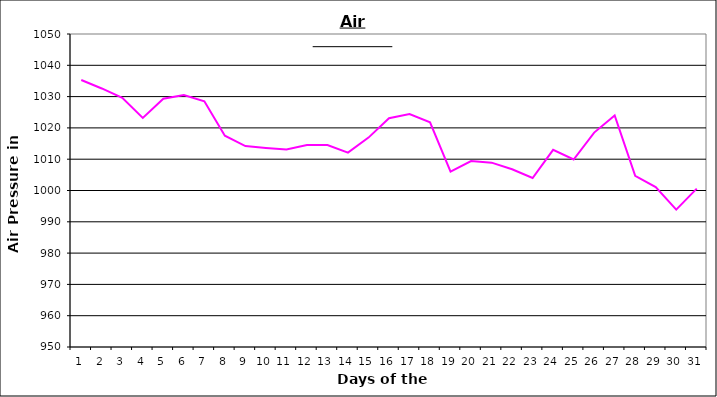
| Category | Series 0 |
|---|---|
| 0 | 1035.3 |
| 1 | 1032.6 |
| 2 | 1029.6 |
| 3 | 1023.2 |
| 4 | 1029.3 |
| 5 | 1030.5 |
| 6 | 1028.5 |
| 7 | 1017.5 |
| 8 | 1014.2 |
| 9 | 1013.6 |
| 10 | 1013.1 |
| 11 | 1014.5 |
| 12 | 1014.5 |
| 13 | 1012.1 |
| 14 | 1016.9 |
| 15 | 1023.1 |
| 16 | 1024.4 |
| 17 | 1021.8 |
| 18 | 1006 |
| 19 | 1009.4 |
| 20 | 1008.9 |
| 21 | 1006.8 |
| 22 | 1004 |
| 23 | 1013 |
| 24 | 1009.9 |
| 25 | 1018.5 |
| 26 | 1024 |
| 27 | 1004.7 |
| 28 | 1001.1 |
| 29 | 993.9 |
| 30 | 1000.6 |